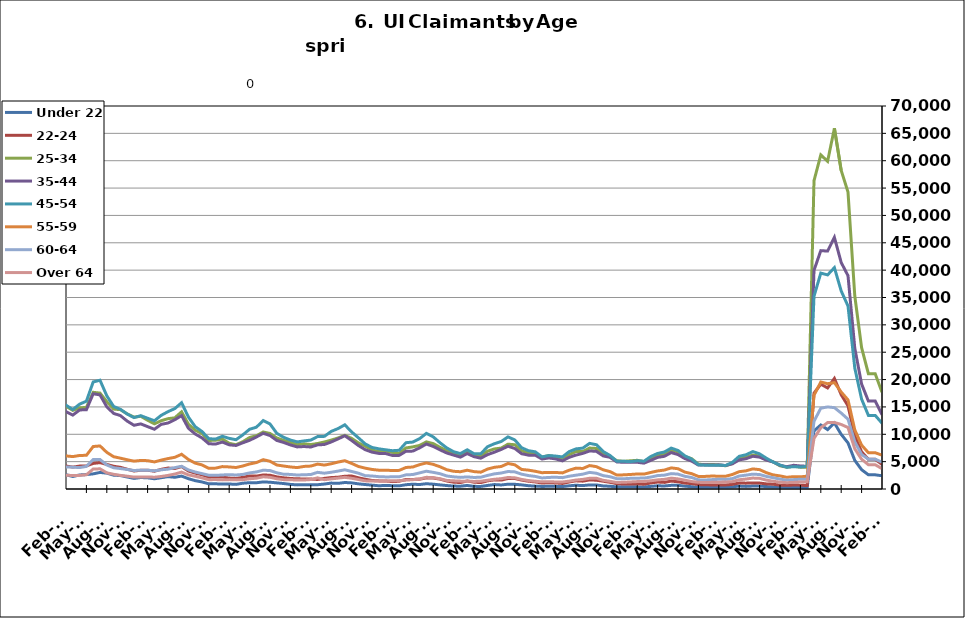
| Category | Under 22 | 22-24 | 25-34 | 35-44 | 45-54 | 55-59 | 60-64 | Over 64 |
|---|---|---|---|---|---|---|---|---|
| 1995-02-28 | 535 | 933 | 5740 | 6206 | 4029 | 1255 | 625 | 276 |
| 1995-03-31 | 534 | 992 | 5856 | 6433 | 4297 | 1294 | 686 | 323 |
| 1995-04-30 | 603 | 1125 | 6814 | 6965 | 4447 | 1392 | 730 | 338 |
| 1995-05-31 | 626 | 1171 | 7442 | 7404 | 4702 | 1383 | 751 | 333 |
| 1995-06-30 | 625 | 1218 | 7514 | 7778 | 4867 | 1435 | 813 | 366 |
| 1995-07-31 | 710 | 1296 | 8612 | 8864 | 5537 | 1595 | 891 | 407 |
| 1995-08-31 | 729 | 1248 | 8185 | 8719 | 5400 | 1604 | 982 | 406 |
| 1995-09-30 | 578 | 1028 | 6615 | 7150 | 4534 | 1351 | 862 | 338 |
| 1995-10-31 | 554 | 957 | 5805 | 6461 | 4159 | 1205 | 741 | 287 |
| 1995-11-30 | 468 | 845 | 5201 | 5826 | 3927 | 1155 | 702 | 254 |
| 1995-12-31 | 517 | 858 | 5350 | 5974 | 4010 | 1153 | 672 | 263 |
| 1996-01-31 | 543 | 927 | 5431 | 6086 | 4208 | 1221 | 685 | 301 |
| 1996-02-29 | 617 | 999 | 5667 | 6535 | 4480 | 1312 | 747 | 305 |
| 1996-03-31 | 622 | 981 | 5896 | 6557 | 4514 | 1362 | 763 | 306 |
| 1996-04-30 | 680 | 1140 | 7032 | 7649 | 5088 | 1527 | 856 | 345 |
| 1996-05-31 | 689 | 1163 | 7220 | 7819 | 5070 | 1521 | 832 | 366 |
| 1996-06-30 | 661 | 1145 | 7344 | 8173 | 5391 | 1568 | 844 | 388 |
| 1996-07-31 | 762 | 1250 | 8375 | 9181 | 6036 | 1755 | 973 | 432 |
| 1996-08-31 | 746 | 1145 | 7829 | 8585 | 5586 | 1651 | 950 | 435 |
| 1996-09-30 | 635 | 992 | 6399 | 7097 | 4790 | 1462 | 804 | 425 |
| 1996-10-31 | 572 | 851 | 5448 | 6291 | 4192 | 1259 | 693 | 340 |
| 1996-11-30 | 531 | 827 | 5003 | 5921 | 3908 | 1153 | 602 | 315 |
| 1996-12-31 | 521 | 789 | 4710 | 5510 | 3673 | 1110 | 610 | 284 |
| 1997-01-31 | 559 | 841 | 5203 | 6172 | 4321 | 1255 | 731 | 328 |
| 1997-02-28 | 556 | 841 | 5187 | 6162 | 4311 | 1250 | 727 | 326 |
| 1997-03-31 | 499 | 806 | 5125 | 6037 | 4176 | 1294 | 702 | 363 |
| 1997-04-30 | 545 | 885 | 5753 | 6709 | 4248 | 1339 | 734 | 339 |
| 1997-05-31 | 612 | 941 | 6146 | 7153 | 4458 | 1348 | 801 | 336 |
| 1997-06-30 | 623 | 995 | 6240 | 7298 | 4662 | 1302 | 776 | 348 |
| 1997-07-31 | 716 | 1154 | 7168 | 8554 | 5489 | 1509 | 903 | 415 |
| 1997-08-31 | 684 | 1072 | 6853 | 8093 | 5222 | 1487 | 837 | 416 |
| 1997-09-30 | 579 | 912 | 5522 | 6592 | 4348 | 1285 | 705 | 380 |
| 1997-10-31 | 516 | 817 | 4894.5 | 5892.5 | 3945 | 1159 | 625 | 344.5 |
| 1997-11-30 | 453 | 722 | 4267 | 5193 | 3542 | 1033 | 545 | 309 |
| 1997-12-31 | 413 | 682 | 3792 | 4755 | 3300 | 1023 | 490 | 266 |
| 1998-01-31 | 489 | 741 | 4044 | 5115 | 3513 | 1099 | 525 | 267 |
| 1998-02-28 | 435 | 684 | 3864 | 4903 | 3549 | 1043 | 571 | 285 |
| 1998-03-31 | 416 | 680 | 3855 | 5086 | 3703 | 1176 | 604 | 297 |
| 1998-04-30 | 592 | 813 | 5092 | 6219 | 4262 | 1336 | 688 | 332 |
| 1998-05-31 | 579 | 849 | 5319 | 6766 | 4554 | 1382 | 729 | 360 |
| 1998-06-30 | 568 | 899 | 5557 | 7101 | 4897 | 1405 | 783 | 367 |
| 1998-07-31 | 691 | 1031 | 6472 | 8095 | 5562 | 1589 | 880 | 392 |
| 1998-08-31 | 673 | 1007 | 6326 | 7950 | 5369 | 1574 | 935 | 393 |
| 1998-09-30 | 548 | 838 | 5206 | 6768 | 4703 | 1432 | 849 | 373 |
| 1998-10-31 | 496 | 776 | 4437 | 5582 | 3875 | 1250 | 711 | 302 |
| 1998-11-30 | 456 | 761 | 4182 | 5332 | 4015 | 1296 | 694 | 308 |
| 1998-12-31 | 442 | 722 | 4010 | 5198 | 4062 | 1331 | 656 | 290 |
| 1999-01-31 | 503 | 830 | 4502 | 5761 | 4521 | 1490 | 751 | 297 |
| 1999-02-28 | 463 | 756 | 4267 | 5576 | 4431 | 1470 | 767 | 301 |
| 1999-03-31 | 435 | 688 | 4119 | 5519 | 4403 | 1516 | 765 | 331 |
| 1999-04-30 | 591 | 949 | 5292 | 7089 | 5468 | 1724 | 914 | 489 |
| 1999-05-31 | 674 | 911 | 5611 | 7459 | 5457 | 1710 | 934 | 500 |
| 1999-06-30 | 640 | 906 | 5660 | 7503 | 5333 | 1695 | 920 | 495 |
| 1999-07-31 | 766 | 1132 | 6820 | 9256 | 6620 | 1981 | 1001 | 549 |
| 1999-08-31 | 738 | 1117 | 6737 | 9030 | 6670 | 2019 | 1075 | 582 |
| 1999-09-30 | 600 | 968 | 5167 | 7169 | 5458 | 1712 | 892 | 465 |
| 1999-10-31 | 494 | 813 | 4501 | 6048 | 4682 | 1443 | 743 | 363 |
| 1999-11-30 | 464 | 768 | 4228 | 5593 | 4564 | 1392 | 702 | 313 |
| 1999-12-31 | 468.5 | 754.5 | 4149 | 5486.5 | 4505 | 1429 | 673 | 304 |
| 2000-01-31 | 473 | 741 | 4070 | 5380 | 4446 | 1466 | 644 | 295 |
| 2000-02-29 | 460 | 691 | 3807 | 5357 | 4470 | 1469 | 707 | 310 |
| 2000-03-31 | 412 | 652 | 3864 | 5499 | 4568 | 1508 | 816 | 389 |
| 2000-04-30 | 585 | 829 | 4741 | 6891 | 5127 | 1631 | 906 | 451 |
| 2000-05-31 | 627 | 875 | 5086 | 7211 | 5238 | 1598 | 956 | 489 |
| 2000-06-30 | 675 | 983 | 5624 | 7826 | 5562 | 1669 | 941 | 524 |
| 2000-07-31 | 802 | 1109 | 6475 | 9102 | 6450 | 1927 | 1097 | 594 |
| 2000-08-31 | 787 | 1058 | 6045 | 8732 | 6157 | 1894 | 1085 | 616 |
| 2000-09-30 | 607 | 897 | 4766 | 6864 | 5037 | 1486 | 902 | 479 |
| 2000-10-31 | 544 | 760 | 4267 | 5897 | 4465 | 1323 | 762 | 394 |
| 2000-11-30 | 535 | 797 | 3982 | 5439 | 4318 | 1256 | 702 | 396 |
| 2000-12-31 | 508 | 832 | 3891 | 5255 | 4218 | 1246 | 694 | 361 |
| 2001-01-31 | 627 | 892 | 4229 | 5724 | 4777 | 1300 | 721 | 393 |
| 2001-02-28 | 643 | 934 | 4553 | 6302 | 5224 | 1529 | 849 | 472 |
| 2001-03-31 | 412 | 648 | 3625 | 5081 | 4551 | 1413 | 778 | 440 |
| 2001-04-30 | 875 | 1276 | 6577 | 8914 | 7196 | 2144 | 1185 | 639 |
| 2001-05-31 | 944 | 1399 | 7133 | 9570 | 7651 | 2265 | 1231 | 679 |
| 2001-06-30 | 1041 | 1584 | 8072 | 11034 | 8621 | 2613 | 1398 | 756 |
| 2001-07-31 | 1135 | 1806 | 9038 | 12514 | 9691 | 2970 | 1611 | 848 |
| 2001-08-31 | 1116 | 1776 | 8753 | 12045 | 9560 | 2963 | 1691 | 898 |
| 2001-09-30 | 1046 | 1705 | 8118 | 11025 | 8788 | 2784 | 1608 | 833 |
| 2001-10-31 | 1094 | 1785 | 8459 | 11114 | 8850 | 2772 | 1610 | 777 |
| 2001-11-30 | 1154 | 1931 | 9131 | 11576 | 9447 | 2973 | 1661 | 778 |
| 2001-12-31 | 1280 | 2191 | 9917 | 11961 | 9905 | 3152 | 1740 | 780 |
| 2002-01-31 | 1330 | 2255 | 10364 | 12730 | 10592 | 3378 | 1843 | 821 |
| 2002-02-28 | 1347 | 2339 | 10349 | 12730 | 10784 | 3499 | 1861 | 867 |
| 2002-03-31 | 1266 | 2231 | 9963 | 12747 | 10614 | 3499 | 1867 | 979 |
| 2002-04-30 | 1412 | 2488 | 11603 | 15825 | 13571 | 4631 | 2389 | 1146 |
| 2002-05-31 | 1455 | 2421 | 11243 | 15509 | 13148 | 4374 | 2359 | 1195 |
| 2002-06-30 | 1534 | 2479 | 11416 | 15594 | 13261 | 4343 | 2365 | 1180 |
| 2002-07-31 | 1513 | 2614 | 11895 | 16242 | 13727 | 4439 | 2428 | 1255 |
| 2002-08-31 | 1022 | 1977 | 8719 | 12054 | 10588 | 3454 | 1990 | 1047 |
| 2002-09-30 | 1391 | 2528 | 10478 | 14010 | 12008 | 3847 | 2161 | 1166 |
| 2002-10-31 | 1401 | 2385 | 9826 | 12727 | 10778 | 3498 | 1886 | 973 |
| 2002-11-30 | 1344 | 2390 | 9846 | 12059 | 10297 | 3367 | 1833 | 958 |
| 2002-12-31 | 1311 | 2403 | 9841 | 11670 | 10177 | 3369 | 1871 | 894 |
| 2003-01-31 | 1311 | 2403 | 9841 | 11670 | 10177 | 3369 | 1871 | 894 |
| 2003-02-28 | 1367 | 2275 | 9730 | 12433 | 10806 | 3687 | 2016 | 974 |
| 2003-03-31 | 1367 | 2357 | 9844 | 12620 | 11167 | 3825 | 2151 | 1094 |
| 2003-04-30 | 1549 | 2525 | 10619 | 14142 | 12182 | 4004 | 2304 | 1190 |
| 2003-05-31 | 1663 | 2698 | 10843 | 14795 | 12539 | 4102 | 2395 | 1256 |
| 2003-06-30 | 1755 | 2770 | 11350 | 15575 | 13251 | 4301 | 2493 | 1325 |
| 2003-07-31 | 1748 | 2791 | 11577 | 15863 | 13772 | 4465 | 2593 | 1371 |
| 2003-08-31 | 1718 | 2653 | 10998 | 15261 | 13219 | 4325 | 2522 | 1359 |
| 2003-09-30 | 1494 | 2521 | 10071 | 13565 | 11659 | 3828 | 2278 | 1286 |
| 2003-10-31 | 1329 | 2432 | 9388 | 12107 | 10693 | 3567 | 2036 | 1129 |
| 2003-11-30 | 1191 | 2226 | 8954 | 11297 | 10037 | 3414 | 2004 | 1068 |
| 2003-12-31 | 1206 | 2184 | 8530 | 10413 | 9335 | 3215 | 1854 | 994 |
| 2004-01-31 | 1216 | 2171 | 8382 | 9858 | 8955 | 2992 | 1736 | 963 |
| 2004-02-29 | 1118 | 1879 | 7614 | 8935 | 8176 | 2761 | 1617 | 943 |
| 2004-03-31 | 1099 | 1749 | 7152 | 8565 | 7769 | 2686 | 1608 | 981 |
| 2004-04-30 | 1241 | 1951 | 7653 | 9981 | 8741 | 2872 | 1685 | 1056 |
| 2004-05-31 | 1245 | 1934 | 7651 | 10203 | 8820 | 2928 | 1703 | 1079 |
| 2004-06-30 | 1316 | 2086 | 8172 | 10636 | 9362 | 3146 | 1843 | 1081 |
| 2004-07-31 | 1476 | 2265 | 8795 | 11511 | 10439 | 3497 | 2008 | 1171 |
| 2004-08-31 | 1390 | 2055 | 8008 | 10418 | 9514 | 3304 | 1909 | 1105 |
| 2004-09-30 | 1129 | 1820 | 6987 | 8661 | 7694 | 2755 | 1623 | 1046 |
| 2004-10-31 | 1037 | 1675 | 6590 | 7964 | 7029 | 2459 | 1461 | 882 |
| 2004-11-30 | 954 | 1638 | 6342 | 7570 | 6733 | 2294 | 1383 | 841 |
| 2004-12-31 | 857 | 1533 | 5921 | 6991 | 6333 | 2225 | 1287 | 764 |
| 2005-01-31 | 893 | 1539 | 6047 | 7410 | 6682 | 2253 | 1274 | 788 |
| 2005-02-28 | 846 | 1361 | 5650 | 6952 | 6404 | 2198 | 1326 | 786 |
| 2005-03-31 | 747 | 1258 | 5313 | 6595 | 6251 | 2151 | 1327 | 742 |
| 2005-04-30 | 877 | 1375 | 5696 | 7717 | 7230 | 2440 | 1401 | 844 |
| 2005-05-31 | 854 | 1408 | 5674 | 7905 | 7454 | 2482 | 1453 | 858 |
| 2005-06-30 | 819 | 1444 | 6028 | 8565 | 7899 | 2613 | 1547 | 890 |
| 2005-07-31 | 900 | 1461 | 6395 | 9124 | 8614 | 2864 | 1640 | 1004 |
| 2005-08-31 | 805 | 1439 | 5917 | 8271 | 8076 | 2692 | 1587 | 945 |
| 2005-09-30 | 631 | 1209 | 4978 | 6413 | 6203 | 2116 | 1312 | 724 |
| 2005-10-31 | 638 | 1134 | 4602 | 6028 | 5688 | 1997 | 1171 | 656 |
| 2005-11-30 | 564 | 1071 | 4409 | 5563 | 5105 | 1791 | 1035 | 580 |
| 2005-12-31 | 523 | 987 | 4014 | 4983 | 4531 | 1673 | 968 | 546 |
| 2006-01-31 | 531 | 925 | 3900 | 5012 | 4793 | 1691 | 1008 | 539 |
| 2006-02-28 | 447 | 804 | 3534 | 4388 | 4403 | 1586 | 980 | 549 |
| 2006-03-31 | 399 | 785 | 3455 | 4472 | 4584 | 1680 | 1069 | 618 |
| 2006-04-30 | 527 | 945 | 4004 | 5859 | 5921 | 1965 | 1251 | 744 |
| 2006-05-31 | 594 | 964 | 4205 | 6365 | 6369 | 2156 | 1327 | 792 |
| 2006-06-30 | 660 | 1113 | 4742 | 7052 | 7094 | 2386 | 1474 | 933 |
| 2006-07-31 | 771 | 1183 | 5214 | 7974 | 8007 | 2685 | 1635 | 1072 |
| 2006-08-31 | 737 | 1202 | 5116 | 7524 | 7553 | 2671 | 1590 | 1019 |
| 2006-09-30 | 596 | 1086 | 4608 | 6175 | 6389 | 2256 | 1287 | 812 |
| 2006-10-31 | 596 | 1056 | 4585 | 5758 | 5788 | 2026 | 1164 | 696 |
| 2006-11-30 | 542 | 1003 | 4370 | 5304 | 5388 | 1812 | 1082 | 604 |
| 2006-12-31 | 553 | 1102 | 4425 | 5291 | 5310 | 1801 | 1099 | 603 |
| 2007-01-31 | 587 | 1147 | 4542 | 5619 | 5506 | 1920 | 1174 | 663 |
| 2007-02-28 | 544 | 1090 | 4490 | 5562 | 5616 | 1982 | 1260 | 705 |
| 2007-03-31 | 558 | 1089 | 4498 | 5595 | 5708 | 2016 | 1378 | 717 |
| 2007-04-30 | 760 | 1203 | 5015 | 6827 | 6871 | 2316 | 1536 | 856 |
| 2007-05-31 | 806 | 1285 | 5542 | 7679 | 7763 | 2571 | 1719 | 1021 |
| 2007-06-30 | 862 | 1340 | 6100 | 8324 | 8341 | 2812 | 1896 | 1060 |
| 2007-07-31 | 980 | 1524 | 6616 | 9184 | 9522 | 3226 | 2038 | 1250 |
| 2007-08-31 | 950 | 1510 | 6266 | 8359 | 8842 | 3033 | 1949 | 1157 |
| 2007-09-30 | 865 | 1595 | 6213 | 7798 | 7957 | 2790 | 1816 | 1090 |
| 2007-10-31 | 883 | 1517 | 6214 | 7229 | 7503 | 2574 | 1630 | 978 |
| 2007-11-15 | 816 | 1424 | 5981 | 6740 | 6999 | 2468 | 1510 | 860 |
| 2007-12-15 09:36:00 | 851 | 1536 | 6411 | 6986 | 7174 | 2572 | 1584 | 874 |
| 2008-01-14 19:12:00 | 963 | 1628 | 6836 | 7533 | 7742 | 2786 | 1744 | 940 |
| 2008-02-14 04:48:00 | 982 | 1565 | 6847 | 7767 | 8031 | 2958 | 1823 | 985 |
| 2008-03-15 14:24:00 | 1029 | 1666 | 7210 | 8036 | 8353 | 3105 | 1898 | 1085 |
| 2008-04-15 | 1182 | 1889 | 7894 | 9339 | 9822 | 3537 | 2184 | 1246 |
| 2008-05-15 09:36:00 | 1325 | 2099 | 8651 | 10315 | 11003 | 3871 | 2423 | 1448 |
| 2008-06-14 19:12:00 | 1405 | 2238 | 9567 | 11330 | 12040 | 4322 | 2650 | 1572 |
| 2008-07-15 04:48:00 | 1616 | 2488 | 10336 | 12349 | 13396 | 4698 | 3083 | 1801 |
| 2008-08-14 14:24:00 | 1753 | 2665 | 10716 | 12486 | 13444 | 4795 | 3139 | 1802 |
| 2008-09-14 | 1800 | 2924 | 11552 | 12686 | 13602 | 4801 | 3180 | 1811 |
| 2008-10-14 09:36:00 | 1936 | 3131 | 12284 | 13322 | 13831 | 4989 | 3183 | 1808 |
| 2008-11-13 19:12:00 | 2093 | 3414 | 13577 | 14724 | 15130 | 5413 | 3440 | 1946 |
| 2008-12-14 04:48:00 | 2495 | 4020 | 15380 | 16325 | 16846 | 6098 | 3755 | 2155 |
| 2009-01-13 14:24:00 | 3054 | 4678 | 17678 | 18452 | 19095 | 6788 | 4182 | 2364 |
| 2009-02-13 | 3531 | 5304 | 19793 | 20788 | 21601 | 7727 | 4836 | 2718 |
| 2009-03-15 09:36:00 | 3891 | 5925 | 22303 | 23139 | 24352 | 8876 | 5515 | 3141 |
| 2009-04-14 19:12:00 | 4291 | 6403 | 23925 | 25362 | 26817 | 9618 | 6020 | 3494 |
| 2009-05-15 04:48:00 | 4410 | 6521 | 24301 | 25794 | 27238 | 9735 | 6181 | 3529 |
| 2009-06-14 14:24:00 | 4405 | 6853 | 25234 | 26806 | 28296 | 10256 | 6673 | 3804 |
| 2009-07-15 | 4729 | 7280 | 26132 | 27836 | 29724 | 10830 | 6950 | 4125 |
| 2009-08-14 09:36:00 | 4717 | 7069 | 25281 | 26184 | 27877 | 10164 | 6719 | 3918 |
| 2009-09-13 19:12:00 | 4741 | 7291 | 25029 | 24981 | 26018 | 9679 | 6210 | 3594 |
| 2009-10-14 04:48:00 | 4656 | 7051 | 24241 | 23779 | 24730 | 9034 | 5817 | 3422 |
| 2009-11-13 14:24:00 | 4421 | 6817 | 23760 | 22851 | 23515 | 8627 | 5549 | 3297 |
| 2009-12-14 | 4232 | 6586 | 23118 | 22038 | 22501 | 8496 | 5370 | 3295 |
| 2010-01-13 09:36:00 | 4276 | 6583 | 22706 | 21421 | 22132 | 8135 | 5154 | 3134 |
| 2010-02-12 19:12:00 | 4133 | 6142 | 21386 | 20012 | 21036 | 7728 | 5039 | 3047 |
| 2010-03-15 04:48:00 | 3784 | 5822 | 20418 | 19073 | 20556 | 7446 | 4983 | 3062 |
| 2010-04-14 14:24:00 | 3731 | 5751 | 20058 | 19261 | 21012 | 7449 | 5078 | 2936 |
| 2010-05-15 | 3516 | 5553 | 19393 | 18793 | 20409 | 7213 | 4923 | 2915 |
| 2010-06-14 09:36:00 | 3450 | 5640 | 19615 | 19385 | 20781 | 7547 | 5293 | 3043 |
| 2010-07-14 19:12:00 | 3536 | 5781 | 19820 | 19714 | 21269 | 7946 | 5439 | 3330 |
| 2010-08-14 04:48:00 | 3477 | 5590 | 18902 | 18548 | 19686 | 7561 | 5039 | 3181 |
| 2010-09-13 14:24:00 | 3083 | 5332 | 17344 | 16712 | 17408 | 6775 | 4612 | 2859 |
| 2010-10-14 | 3004 | 5138 | 17187 | 16492 | 17042 | 6713 | 4418 | 2779 |
| 2010-11-13 09:36:00 | 2724 | 4771 | 16387 | 15438 | 16061 | 6360 | 4209 | 2601 |
| 2010-12-13 19:12:00 | 2335 | 4159 | 15175 | 14143 | 14646 | 5823 | 4003 | 2480 |
| 2011-01-13 04:48:00 | 2530 | 4343 | 15492 | 14596 | 15561 | 6250 | 4059 | 2487 |
| 2011-02-12 14:24:00 | 2609 | 4202 | 15131 | 14142 | 15320 | 6044 | 4041 | 2517 |
| 2011-03-15 | 2290 | 3998 | 14370 | 13505 | 14523 | 5925 | 3990 | 2470 |
| 2011-04-14 09:36:00 | 2563 | 4190 | 14834 | 14445 | 15508 | 6130 | 3916 | 2488 |
| 2011-05-14 19:12:00 | 2642 | 4217 | 14917 | 14494 | 16051 | 6156 | 4129 | 2602 |
| 2011-06-14 04:48:00 | 2767 | 4676 | 17673 | 17404 | 19563 | 7763 | 5398 | 3653 |
| 2011-07-14 14:24:00 | 3027 | 4815 | 17530 | 17197 | 19880 | 7870 | 5384 | 3686 |
| 2011-08-14 | 2900 | 4498 | 15970 | 15020 | 17035 | 6697 | 4394 | 2956 |
| 2011-09-13 09:36:00 | 2531 | 4156 | 14609 | 13818 | 15092 | 5903 | 3881 | 2687 |
| 2011-10-13 19:12:00 | 2452 | 3959 | 14501 | 13415 | 14565 | 5635 | 3734 | 2491 |
| 2011-11-13 04:48:00 | 2197 | 3615 | 13732 | 12410 | 13698 | 5345 | 3574 | 2339 |
| 2011-12-13 14:24:00 | 1938 | 3290 | 13130 | 11646 | 13054 | 5089 | 3380 | 2177 |
| 2012-01-13 | 2098 | 3424 | 13293 | 11897 | 13400 | 5218 | 3448 | 2197 |
| 2012-02-12 09:36:00 | 2047 | 3428 | 12569 | 11400 | 12931 | 5177 | 3445 | 2212 |
| 2012-03-13 19:12:00 | 1870 | 3252 | 11913 | 10922 | 12476 | 4948 | 3317 | 2155 |
| 2012-04-13 04:48:00 | 2063 | 3590 | 12479 | 11814 | 13464 | 5278 | 3509 | 2287 |
| 2012-05-13 14:24:00 | 2260 | 3828 | 12852 | 12063 | 14139 | 5562 | 3628 | 2485 |
| 2012-06-13 | 2147 | 3747 | 13008 | 12659 | 14694 | 5791 | 3902 | 2736 |
| 2012-07-13 09:36:00 | 2358 | 4087 | 14109 | 13412 | 15770 | 6346 | 4156 | 3086 |
| 2012-08-12 19:12:00 | 1887 | 3284 | 11852 | 11102 | 13153 | 5396 | 3487 | 2583 |
| 2012-09-12 04:48:00 | 1524 | 2903 | 10742 | 10051 | 11393 | 4726 | 3103 | 2327 |
| 2012-10-12 14:24:00 | 1289 | 2603 | 10123 | 9339 | 10510 | 4405 | 2813 | 2032 |
| 2012-11-12 | 945 | 2155 | 8870 | 8273 | 9193 | 3781 | 2520 | 1702 |
| 2012-12-12 09:36:00 | 937 | 2201 | 8913 | 8210 | 9124 | 3816 | 2491 | 1722 |
| 2013-01-11 19:12:00 | 934 | 2199 | 9132 | 8579 | 9635 | 4095 | 2569 | 1667 |
| 2013-02-11 04:48:00 | 915 | 1996 | 8343 | 8072 | 9253 | 4034 | 2623 | 1715 |
| 2013-03-13 14:24:00 | 845 | 1934 | 8092 | 7955 | 9007 | 3929 | 2561 | 1667 |
| 2013-04-13 | 1055 | 2124 | 8637 | 8445 | 9891 | 4204 | 2666 | 1698 |
| 2013-05-13 09:36:00 | 1160 | 2394 | 9413 | 8898 | 10920 | 4574 | 2940 | 1871 |
| 2013-06-12 19:12:00 | 1145 | 2351 | 9732 | 9510 | 11293 | 4830 | 3115 | 1976 |
| 2013-07-13 04:48:00 | 1294 | 2558 | 10421 | 10174 | 12520 | 5363 | 3434 | 2233 |
| 2013-08-12 14:24:00 | 1238 | 2519 | 10150 | 9771 | 11886 | 5067 | 3372 | 2140 |
| 2013-09-12 | 1116 | 2214 | 9323 | 8874 | 10178 | 4389 | 2964 | 1871 |
| 2013-10-12 09:36:00 | 1000 | 2044 | 8893 | 8509 | 9449 | 4200 | 2701 | 1709 |
| 2013-11-11 19:12:00 | 842 | 1927 | 8532 | 8049 | 8950 | 4028 | 2665 | 1675 |
| 2013-12-12 04:48:00 | 753 | 1854 | 8098 | 7692 | 8612 | 3913 | 2557 | 1655 |
| 2014-01-11 14:24:00 | 788 | 1846 | 8270 | 7762 | 8786 | 4128 | 2606 | 1642 |
| 2014-02-11 | 795 | 1817 | 8124 | 7677 | 8944 | 4189 | 2646 | 1728 |
| 2014-03-13 09:36:00 | 782 | 1741 | 8319 | 8063 | 9583 | 4550 | 3048 | 2040 |
| 2014-04-12 19:12:00 | 905 | 1940 | 8594 | 8138 | 9620 | 4372 | 2886 | 1706 |
| 2014-05-13 04:48:00 | 1079 | 2093 | 8933 | 8593 | 10522 | 4609 | 3062 | 1850 |
| 2014-06-12 14:24:00 | 1028 | 2152 | 9323 | 9148 | 11040 | 4920 | 3274 | 1985 |
| 2014-07-13 | 1189 | 2333 | 9808 | 9735 | 11729 | 5171 | 3509 | 2133 |
| 2014-08-14 | 1119 | 2379 | 9259 | 8876 | 10438 | 4678 | 3210 | 1962 |
| 2014-09-13 09:36:00 | 943 | 2048 | 8430 | 7946 | 9358 | 4119 | 2891 | 1734 |
| 2014-10-13 19:12:00 | 816 | 1781 | 7821 | 7185 | 8244 | 3813 | 2437 | 1486 |
| 2014-11-13 04:48:00 | 703 | 1557 | 7150 | 6736 | 7594 | 3571 | 2374 | 1466 |
| 2014-12-13 14:24:00 | 597 | 1482 | 6833 | 6507 | 7340 | 3442 | 2255 | 1458 |
| 2015-01-13 | 646 | 1466 | 6927 | 6477 | 7168 | 3432 | 2210 | 1429 |
| 2015-02-12 09:36:00 | 607 | 1346 | 6696 | 6134 | 6999 | 3383 | 2220 | 1525 |
| 2015-03-14 19:12:00 | 577 | 1416 | 6499 | 6145 | 7077 | 3405 | 2233 | 1530 |
| 2015-04-14 04:48:00 | 784 | 1736 | 7505 | 6901 | 8468 | 3935 | 2586 | 1624 |
| 2015-05-14 14:24:00 | 875 | 1749 | 7696 | 6925 | 8578 | 4020 | 2644 | 1698 |
| 2015-06-14 | 818 | 1789 | 7961 | 7519 | 9200 | 4452 | 2943 | 1839 |
| 2015-07-14 09:36:00 | 966 | 2033 | 8609 | 8223 | 10167 | 4766 | 3254 | 2136 |
| 2015-08-13 19:12:00 | 880 | 2007 | 8302 | 7779 | 9530 | 4503 | 3045 | 2073 |
| 2015-09-13 04:48:00 | 752 | 1807 | 7615 | 7153 | 8455 | 4067 | 2798 | 1870 |
| 2015-10-13 14:24:00 | 630 | 1461 | 6995 | 6578 | 7509 | 3519 | 2375 | 1570 |
| 2015-11-13 | 533 | 1246 | 6491 | 6196 | 6815 | 3237 | 2224 | 1493 |
| 2015-12-13 09:36:00 | 512 | 1179 | 6242 | 5823 | 6474 | 3158 | 2123 | 1439 |
| 2016-01-12 19:12:00 | 646 | 1466 | 6927 | 6477 | 7168 | 3432 | 2210 | 1429 |
| 2016-02-12 04:48:00 | 482 | 1246 | 6101 | 5912 | 6452 | 3180 | 2110 | 1385 |
| 2016-03-13 14:24:00 | 474 | 1170 | 6011 | 5629 | 6452 | 3073 | 2152 | 1420 |
| 2016-04-13 | 648 | 1494 | 6917 | 6287 | 7737 | 3648 | 2483 | 1600 |
| 2016-05-13 09:36:00 | 812 | 1670 | 7326 | 6725 | 8279 | 3967 | 2765 | 1776 |
| 2016-06-12 19:12:00 | 738 | 1622 | 7479 | 7230 | 8681 | 4111 | 2920 | 1886 |
| 2016-07-13 04:48:00 | 875 | 1919 | 8193 | 7814 | 9525 | 4662 | 3196 | 2105 |
| 2016-08-12 14:24:00 | 858 | 1920 | 8091 | 7407 | 8969 | 4420 | 3130 | 2050 |
| 2016-09-12 | 752 | 1632 | 6992 | 6450 | 7548 | 3573 | 2713 | 1747 |
| 2016-10-12 09:36:00 | 602 | 1423 | 6590 | 6190 | 6998 | 3448 | 2457 | 1544 |
| 2016-11-11 19:12:00 | 523 | 1296 | 6418 | 6179 | 6801 | 3241 | 2299 | 1410 |
| 2016-12-12 04:48:00 | 468 | 1096 | 5827 | 5472 | 5867 | 2981 | 2019 | 1311 |
| 2017-01-11 14:24:00 | 495 | 1150 | 6111 | 5679 | 6108 | 3035 | 2115 | 1342 |
| 2017-02-11 | 484 | 1109 | 5882 | 5500 | 6023 | 3023 | 2148 | 1289 |
| 2017-03-13 09:36:00 | 442 | 1015 | 5634 | 5148 | 5865 | 2942 | 2075 | 1278 |
| 2017-04-12 19:12:00 | 585 | 1285 | 6292 | 5783 | 6842 | 3434 | 2336 | 1435 |
| 2017-05-13 04:48:00 | 686 | 1492 | 6844 | 6200 | 7332 | 3817 | 2526 | 1637 |
| 2017-06-12 14:24:00 | 623 | 1435 | 6852 | 6505 | 7473 | 3751 | 2713 | 1754 |
| 2017-07-13 | 745 | 1658 | 7483 | 6953 | 8339 | 4284 | 3038 | 1964 |
| 2017-08-12 09:36:00 | 745 | 1605 | 7411 | 6880 | 8092 | 4080 | 2878 | 1966 |
| 2017-09-11 19:12:00 | 559 | 1420 | 6481 | 6045 | 6845 | 3511 | 2443 | 1591 |
| 2017-10-12 04:48:00 | 503 | 1224 | 5960 | 5790 | 6135 | 3181 | 2245 | 1400 |
| 2017-11-11 14:24:00 | 390 | 972 | 5167 | 4951 | 5077 | 2553 | 1887 | 1188 |
| 2017-12-12 | 413 | 914 | 5058 | 4876 | 5071 | 2585 | 1870 | 1226 |
| 2018-01-11 09:36:00 | 411 | 912 | 5154 | 4909 | 5000 | 2656 | 1952 | 1288 |
| 2018-02-10 19:12:00 | 383 | 940 | 5246 | 4884 | 5165 | 2743 | 1980 | 1355 |
| 2018-03-13 04:48:00 | 373 | 875 | 5018 | 4724 | 5075 | 2723 | 1999 | 1389 |
| 2018-04-12 14:24:00 | 478 | 1104 | 5584 | 5240 | 5944 | 3026 | 2179 | 1506 |
| 2018-05-13 | 586 | 1275 | 6280 | 5780 | 6500 | 3300 | 2452 | 1670 |
| 2018-06-12 09:36:00 | 554 | 1207 | 6302 | 5974 | 6766 | 3462 | 2534 | 1762 |
| 2018-07-12 19:12:00 | 666 | 1445 | 7024 | 6656 | 7473 | 3858 | 2810 | 1989 |
| 2018-08-12 04:48:00 | 671 | 1323 | 6823 | 6293 | 7046 | 3706 | 2722 | 1850 |
| 2018-09-11 14:24:00 | 518 | 1084 | 5965 | 5563 | 6066 | 3091 | 2318 | 1618 |
| 2018-10-12 | 419 | 985 | 5538 | 5106 | 5464 | 2806 | 2102 | 1367 |
| 2018-11-11 09:36:00 | 306 | 808 | 4542 | 4371 | 4433 | 2297 | 1673 | 1222 |
| 2018-12-11 19:12:00 | 328 | 771 | 4439 | 4429 | 4340 | 2303 | 1646 | 1174 |
| 2019-01-11 04:48:00 | 327 | 743 | 4491 | 4378 | 4359 | 2368 | 1715 | 1218 |
| 2019-02-10 14:24:00 | 338 | 739 | 4402 | 4415 | 4345 | 2337 | 1773 | 1237 |
| 2019-03-13 | 306 | 738 | 4246 | 4293 | 4304 | 2328 | 1756 | 1281 |
| 2019-04-12 09:36:00 | 396 | 850 | 4657 | 4603 | 4871 | 2655 | 1900 | 1347 |
| 2019-05-12 19:12:00 | 541 | 1092 | 5700 | 5319 | 5974 | 3169 | 2371 | 1690 |
| 2019-06-12 04:48:00 | 476 | 1070 | 5822 | 5537 | 6262 | 3317 | 2534 | 1820 |
| 2019-07-12 14:24:00 | 538 | 1114 | 6206 | 5980 | 6836 | 3673 | 2717 | 1996 |
| 2019-08-12 | 528 | 1084 | 6044 | 5828 | 6422 | 3535 | 2645 | 1942 |
| 2019-09-11 09:36:00 | 445 | 932 | 5379 | 5275 | 5630 | 2979 | 2299 | 1624 |
| 2019-10-11 19:12:00 | 372 | 877 | 4949 | 4938 | 4922 | 2579 | 2058 | 1418 |
| 2019-11-11 04:48:00 | 332 | 701 | 4242 | 4332 | 4379 | 2392 | 1809 | 1247 |
| 2019-12-11 14:24:00 | 261 | 663 | 3977 | 4071 | 3974 | 2137 | 1619 | 1150 |
| 2020-01-11 | 272 | 724 | 4153 | 4331 | 4085 | 2258 | 1715 | 1206 |
| 2020-02-10 09:36:00 | 274 | 704 | 3992 | 4211 | 4020 | 2226 | 1784 | 1286 |
| 2020-03-11 19:12:00 | 291 | 630 | 3985 | 4153 | 4136 | 2332 | 1794 | 1308 |
| 2020-04-11 04:48:00 | 10628 | 17510 | 56346 | 39970 | 35225 | 17140 | 12379 | 9237 |
| 2020-05-11 14:24:00 | 11700 | 19159 | 61067 | 43562 | 39459 | 19553 | 14765 | 11197 |
| 2020-06-11 | 10859 | 18470 | 59897 | 43484 | 39131 | 19246 | 15000 | 12140 |
| 2020-07-11 09:36:00 | 12066 | 20204 | 65924 | 45983 | 40459 | 19436 | 14870 | 12160 |
| 2020-08-10 19:12:00 | 9989 | 17237 | 58218 | 41395 | 36191 | 17725 | 13875 | 11793 |
| 2020-09-10 04:48:00 | 8425 | 15201 | 54260 | 38988 | 33440 | 16290 | 12758 | 11237 |
| 2020-10-10 14:24:00 | 5224 | 9693 | 35264 | 25722 | 22091 | 10801 | 8611 | 7331 |
| 2020-11-10 | 3533 | 6796 | 25816 | 19183 | 16424 | 8018 | 6314 | 5449 |
| 2020-12-10 09:36:00 | 2593 | 5424 | 21071 | 16063 | 13455 | 6630 | 5449 | 4436 |
| 2021-01-09 19:12:00 | 2593 | 5424 | 21071 | 16063 | 13455 | 6630 | 5449 | 4436 |
| 2021-02-09 04:48:00 | 2420 | 4500 | 17683 | 13595 | 12022 | 6183 | 4899 | 3716 |